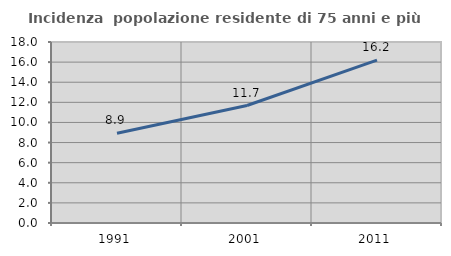
| Category | Incidenza  popolazione residente di 75 anni e più |
|---|---|
| 1991.0 | 8.923 |
| 2001.0 | 11.685 |
| 2011.0 | 16.2 |